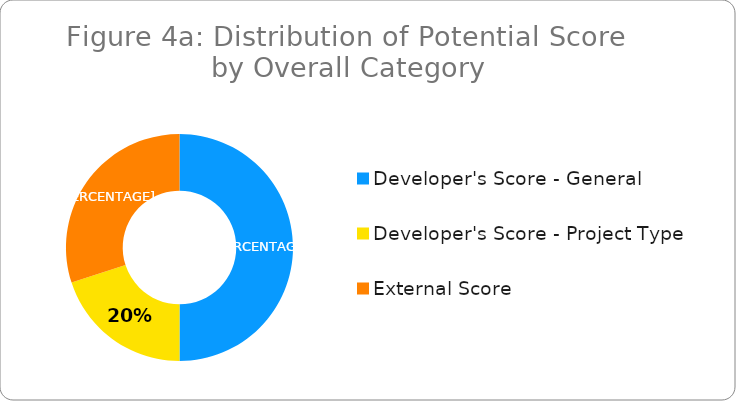
| Category | Series 0 |
|---|---|
| Developer's Score - General | 25 |
| Developer's Score - Project Type | 10 |
| External Score | 15 |